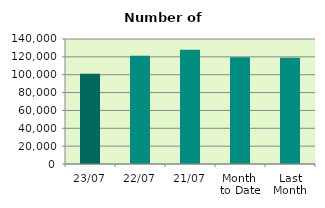
| Category | Series 0 |
|---|---|
| 23/07 | 101000 |
| 22/07 | 121254 |
| 21/07 | 127878 |
| Month 
to Date | 119681.529 |
| Last
Month | 119107.818 |